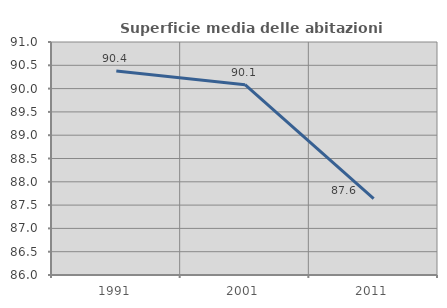
| Category | Superficie media delle abitazioni occupate |
|---|---|
| 1991.0 | 90.376 |
| 2001.0 | 90.084 |
| 2011.0 | 87.64 |